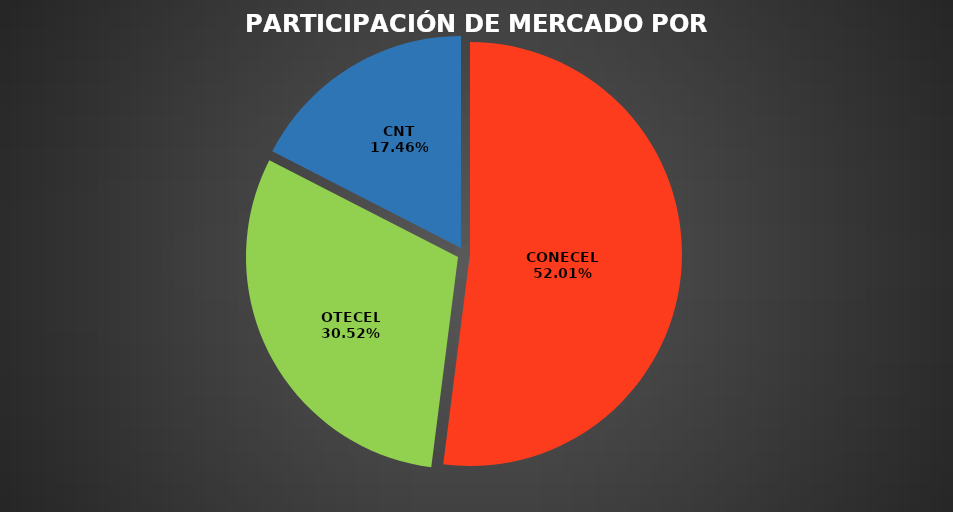
| Category | May 2023 |
|---|---|
| CONECEL | 9259499 |
| OTECEL | 5433930 |
| CNT | 3108405 |